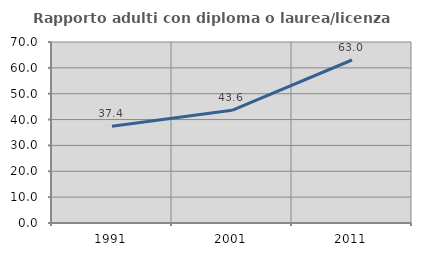
| Category | Rapporto adulti con diploma o laurea/licenza media  |
|---|---|
| 1991.0 | 37.386 |
| 2001.0 | 43.59 |
| 2011.0 | 63.041 |